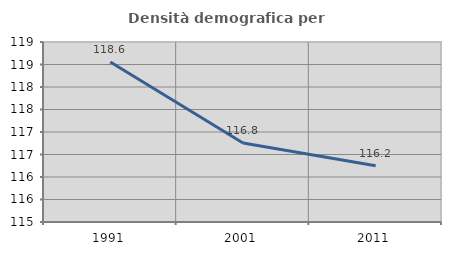
| Category | Densità demografica |
|---|---|
| 1991.0 | 118.555 |
| 2001.0 | 116.755 |
| 2011.0 | 116.249 |